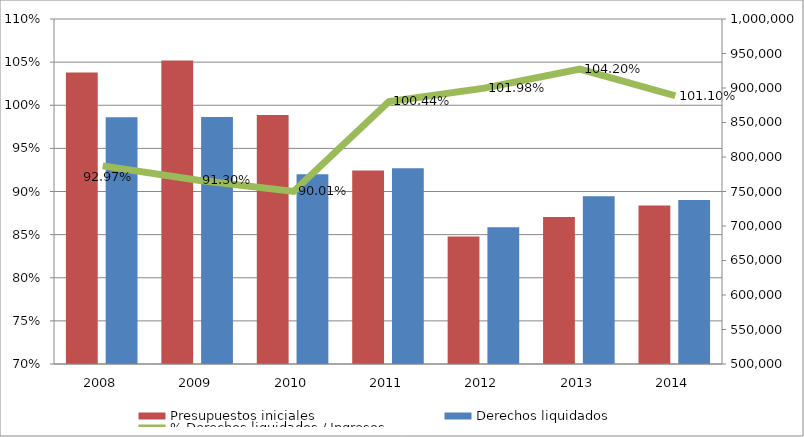
| Category | Presupuestos iniciales | Derechos liquidados |
|---|---|---|
| 2008.0 | 922294.818 | 857449.768 |
| 2009.0 | 939676.058 | 857886.256 |
| 2010.0 | 861041.347 | 774982.94 |
| 2011.0 | 780284.157 | 783705.016 |
| 2012.0 | 684688.152 | 698264.246 |
| 2013.0 | 713002.158 | 742940.524 |
| 2014.0 | 729663.12 | 737702.75 |